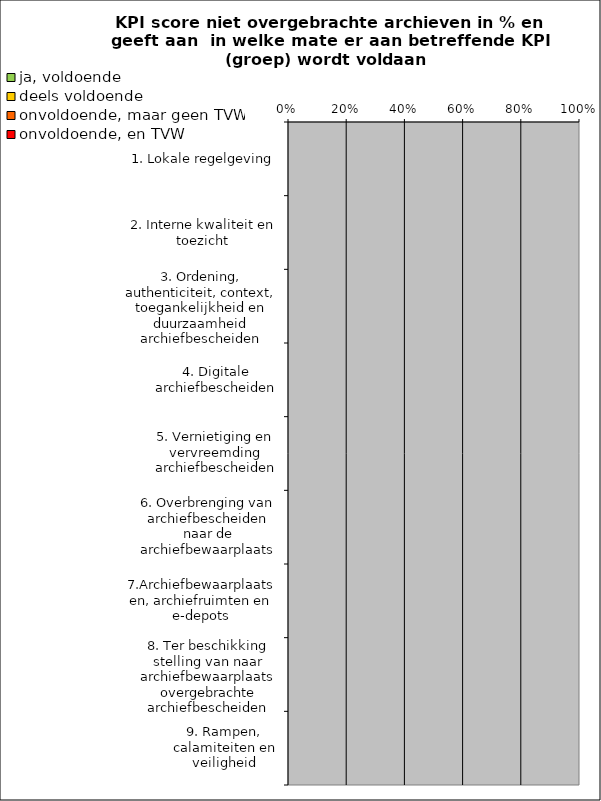
| Category | ja, voldoende | deels voldoende | onvoldoende, maar geen TVW | onvoldoende, en TVW |
|---|---|---|---|---|
| 1. Lokale regelgeving | 0 | 0 | 0 | 0 |
| 2. Interne kwaliteit en toezicht | 0 | 0 | 0 | 0 |
| 3. Ordening, authenticiteit, context, toegankelijkheid en duurzaamheid archiefbescheiden | 0 | 0 | 0 | 0 |
| 4. Digitale archiefbescheiden | 0 | 0 | 0 | 0 |
| 5. Vernietiging en vervreemding archiefbescheiden | 0 | 0 | 0 | 0 |
| 6. Overbrenging van archiefbescheiden naar de archiefbewaarplaats | 0 | 0 | 0 | 0 |
| 7.Archiefbewaarplaatsen, archiefruimten en e-depots | 0 | 0 | 0 | 0 |
| 8. Ter beschikking stelling van naar archiefbewaarplaats overgebrachte archiefbescheiden | 0 | 0 | 0 | 0 |
| 9. Rampen, calamiteiten en veiligheid | 0 | 0 | 0 | 0 |